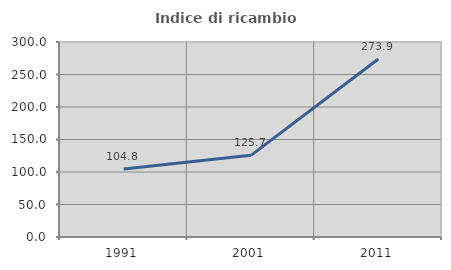
| Category | Indice di ricambio occupazionale  |
|---|---|
| 1991.0 | 104.762 |
| 2001.0 | 125.658 |
| 2011.0 | 273.913 |